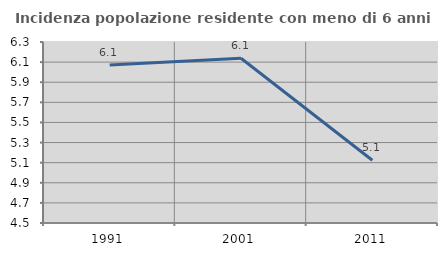
| Category | Incidenza popolazione residente con meno di 6 anni |
|---|---|
| 1991.0 | 6.072 |
| 2001.0 | 6.139 |
| 2011.0 | 5.124 |